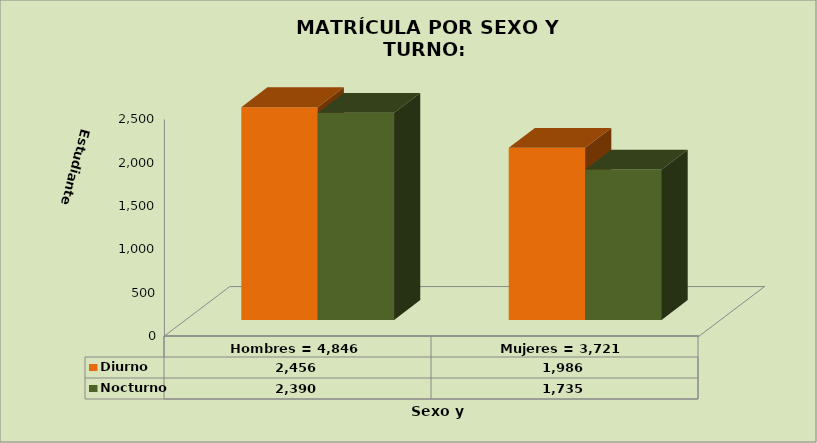
| Category | Diurno | Nocturno |
|---|---|---|
| Hombres = 4,846 | 2456 | 2390 |
| Mujeres = 3,721 | 1986 | 1735 |